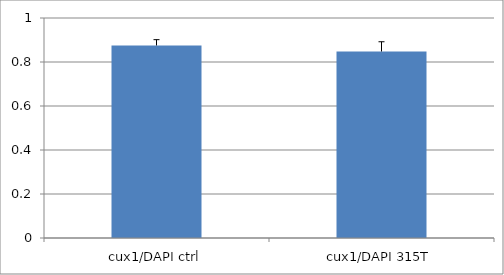
| Category | Series 0 |
|---|---|
| cux1/DAPI ctrl | 0.875 |
| cux1/DAPI 315T | 0.848 |